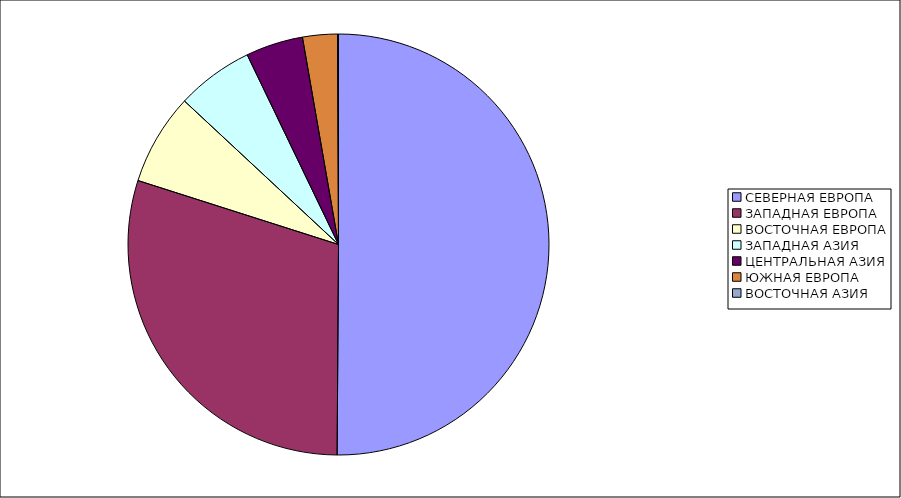
| Category | Оборот |
|---|---|
| СЕВЕРНАЯ ЕВРОПА | 50.105 |
| ЗАПАДНАЯ ЕВРОПА | 29.809 |
| ВОСТОЧНАЯ ЕВРОПА | 7.02 |
| ЗАПАДНАЯ АЗИЯ | 5.926 |
| ЦЕНТРАЛЬНАЯ АЗИЯ | 4.397 |
| ЮЖНАЯ ЕВРОПА | 2.673 |
| ВОСТОЧНАЯ АЗИЯ | 0.07 |